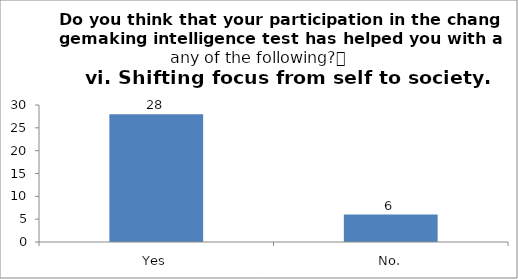
| Category | Do you think that your participation in the changemaking intelligence test has helped you with any of the following?
vi. Shifting focus from self to society. |
|---|---|
| Yes | 28 |
| No. | 6 |